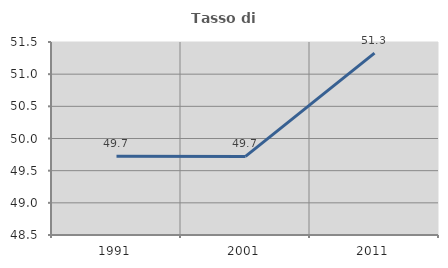
| Category | Tasso di occupazione   |
|---|---|
| 1991.0 | 49.726 |
| 2001.0 | 49.721 |
| 2011.0 | 51.326 |